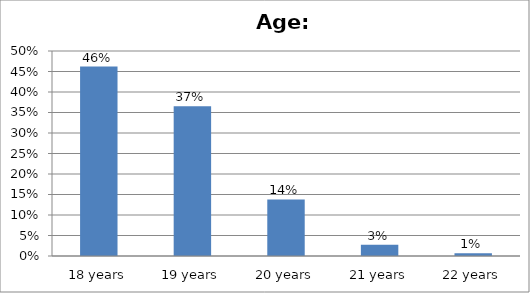
| Category | Series 0 |
|---|---|
| 18 years | 0.462 |
| 19 years | 0.366 |
| 20 years | 0.138 |
| 21 years | 0.028 |
| 22 years | 0.007 |